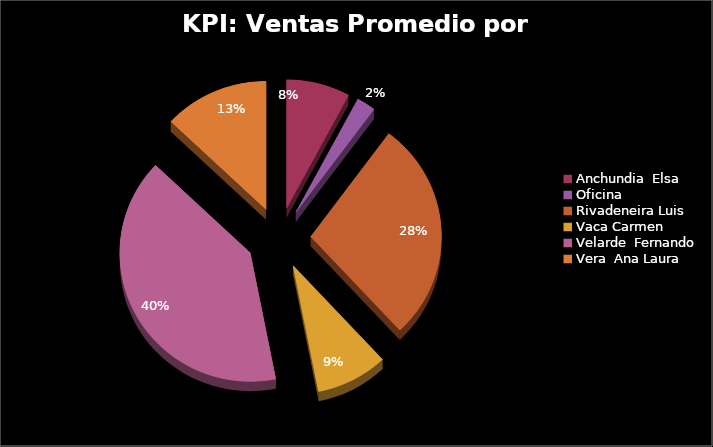
| Category | KPI: Ventas Promedio por Vendedor |
|---|---|
| Anchundia  Elsa  | 158.686 |
| Oficina | 47.008 |
| Rivadeneira Luis  | 562.973 |
| Vaca Carmen  | 178.658 |
| Velarde  Fernando  | 811.12 |
| Vera  Ana Laura | 262.3 |